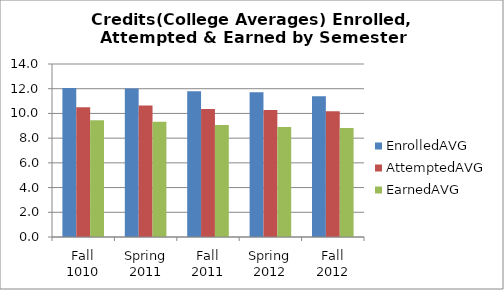
| Category | EnrolledAVG | AttemptedAVG | EarnedAVG |
|---|---|---|---|
| Fall 1010 | 12.065 | 10.496 | 9.456 |
| Spring 2011 | 12.023 | 10.634 | 9.322 |
| Fall 2011 | 11.796 | 10.364 | 9.06 |
| Spring 2012 | 11.713 | 10.272 | 8.902 |
| Fall 2012 | 11.38 | 10.184 | 8.827 |